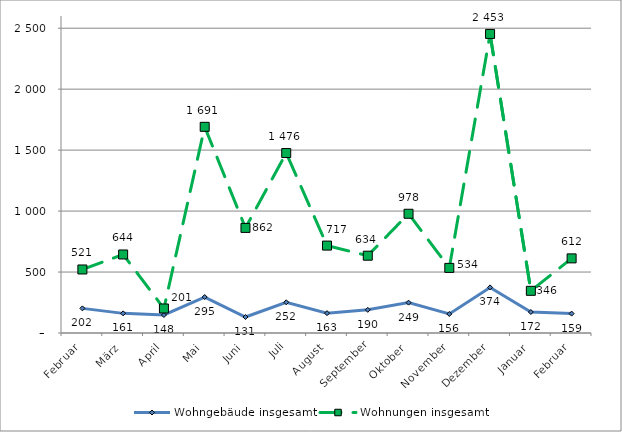
| Category | Wohngebäude insgesamt | Wohnungen insgesamt |
|---|---|---|
| Februar | 202 | 521 |
| März | 161 | 644 |
| April | 148 | 201 |
| Mai | 295 | 1691 |
| Juni | 131 | 862 |
| Juli | 252 | 1476 |
| August | 163 | 717 |
| September | 190 | 634 |
| Oktober | 249 | 978 |
| November | 156 | 534 |
| Dezember | 374 | 2453 |
| Januar | 172 | 346 |
| Februar | 159 | 612 |